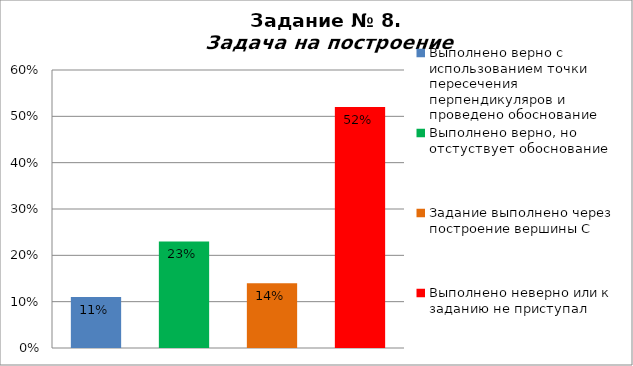
| Category | Задача на построение |
|---|---|
| Выполнено верно с использованием точки пересечения перпендикуляров и проведено обоснование | 0.11 |
| Выполнено верно, но отстуствует обоснование | 0.23 |
| Задание выполнено через построение вершины С | 0.14 |
| Выполнено неверно или к заданию не приступал | 0.52 |